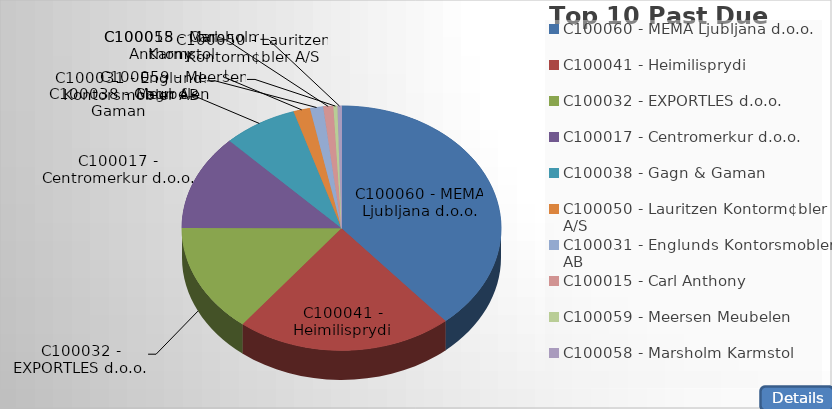
| Category | Total |
|---|---|
| C100060 - MEMA Ljubljana d.o.o. | 357053649 |
| C100041 - Heimilisprydi | 202002561.34 |
| C100032 - EXPORTLES d.o.o. | 132878707 |
| C100017 - Centromerkur d.o.o. | 116207334.5 |
| C100038 - Gagn & Gaman | 69368525.95 |
| C100050 - Lauritzen Kontorm¢bler A/S | 15581518.84 |
| C100031 - Englunds Kontorsmobler AB | 12259394.71 |
| C100015 - Carl Anthony | 9371534.52 |
| C100059 - Meersen Meubelen | 3815491.81 |
| C100058 - Marsholm Karmstol | 3740283.34 |